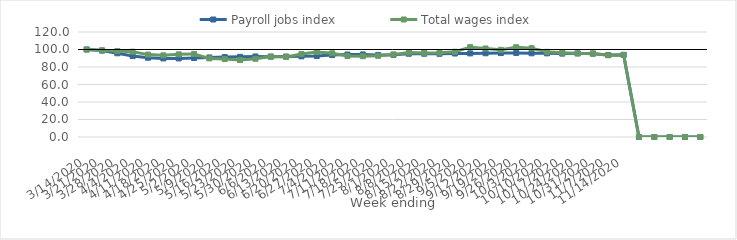
| Category | Payroll jobs index | Total wages index |
|---|---|---|
| 14/03/2020 | 100 | 100 |
| 21/03/2020 | 98.767 | 99.029 |
| 28/03/2020 | 95.692 | 98.176 |
| 04/04/2020 | 92.499 | 97.496 |
| 11/04/2020 | 90.593 | 94.155 |
| 18/04/2020 | 89.819 | 93.314 |
| 25/04/2020 | 89.816 | 94.491 |
| 02/05/2020 | 90.255 | 94.936 |
| 09/05/2020 | 90.914 | 89.846 |
| 16/05/2020 | 91.31 | 89.066 |
| 23/05/2020 | 91.577 | 87.948 |
| 30/05/2020 | 92.022 | 89.414 |
| 06/06/2020 | 91.816 | 91.932 |
| 13/06/2020 | 91.959 | 91.554 |
| 20/06/2020 | 92.178 | 94.906 |
| 27/06/2020 | 92.577 | 97.119 |
| 04/07/2020 | 93.656 | 95.685 |
| 11/07/2020 | 94.26 | 92.541 |
| 18/07/2020 | 94.34 | 92.339 |
| 25/07/2020 | 93.819 | 92.807 |
| 01/08/2020 | 93.87 | 94.35 |
| 08/08/2020 | 95.162 | 96.431 |
| 15/08/2020 | 95.19 | 96.128 |
| 22/08/2020 | 95.103 | 96.317 |
| 29/08/2020 | 95.418 | 97.399 |
| 05/09/2020 | 95.545 | 102.692 |
| 12/09/2020 | 95.709 | 101.159 |
| 19/09/2020 | 95.928 | 99.616 |
| 26/09/2020 | 96.039 | 102.622 |
| 03/10/2020 | 95.695 | 101.513 |
| 10/10/2020 | 95.62 | 97.338 |
| 17/10/2020 | 95.309 | 96.285 |
| 24/10/2020 | 95.587 | 95.523 |
| 31/10/2020 | 95.264 | 95.542 |
| 07/11/2020 | 93.726 | 93.438 |
| 14/11/2020 | 93.952 | 93.702 |